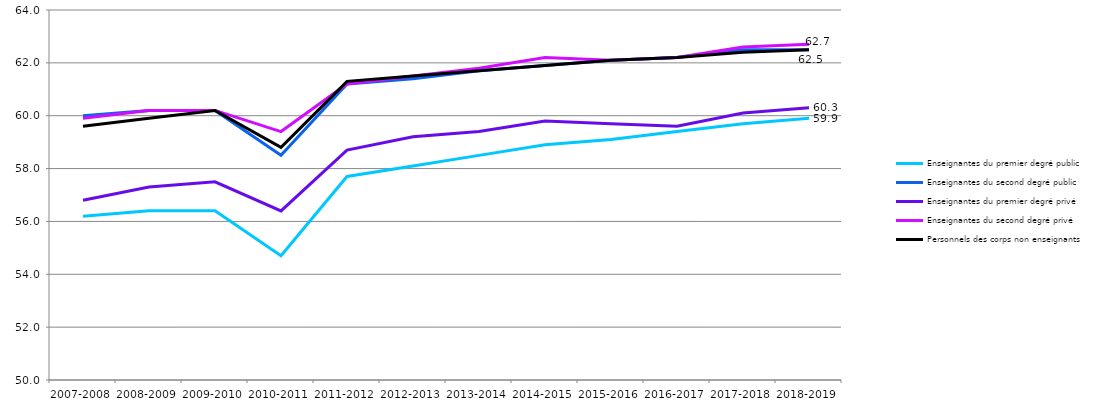
| Category | Enseignantes du premier degré public | Enseignantes du second degré public | Enseignantes du premier degré privé | Enseignantes du second degré privé | Personnels des corps non enseignants  |
|---|---|---|---|---|---|
| 2007-2008 | 56.2 | 60 | 56.8 | 59.9 | 59.6 |
| 2008-2009 | 56.4 | 60.2 | 57.3 | 60.2 | 59.9 |
| 2009-2010 | 56.4 | 60.2 | 57.5 | 60.2 | 60.2 |
| 2010-2011 | 54.7 | 58.5 | 56.4 | 59.4 | 58.8 |
| 2011-2012 | 57.7 | 61.2 | 58.7 | 61.2 | 61.3 |
| 2012-2013 | 58.1 | 61.4 | 59.2 | 61.5 | 61.5 |
| 2013-2014 | 58.5 | 61.7 | 59.4 | 61.8 | 61.7 |
| 2014-2015 | 58.9 | 61.9 | 59.8 | 62.2 | 61.9 |
| 2015-2016 | 59.1 | 62.1 | 59.7 | 62.1 | 62.1 |
| 2016-2017 | 59.4 | 62.2 | 59.6 | 62.2 | 62.2 |
| 2017-2018 | 59.7 | 62.5 | 60.1 | 62.6 | 62.4 |
| 2018-2019 | 59.9 | 62.5 | 60.3 | 62.7 | 62.5 |